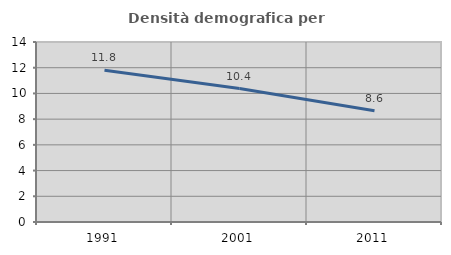
| Category | Densità demografica |
|---|---|
| 1991.0 | 11.806 |
| 2001.0 | 10.379 |
| 2011.0 | 8.645 |